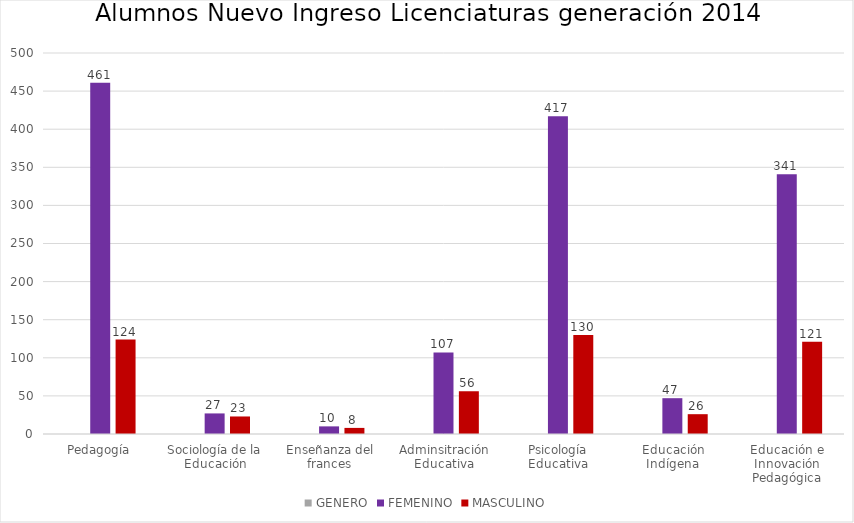
| Category | GENERO | FEMENINO | MASCULINO |
|---|---|---|---|
| Pedagogía |  | 461 | 124 |
| Sociología de la Educación |  | 27 | 23 |
| Enseñanza del frances |  | 10 | 8 |
| Adminsitración Educativa |  | 107 | 56 |
| Psicología Educativa |  | 417 | 130 |
| Educación Indígena |  | 47 | 26 |
| Educación e Innovación Pedagógica |  | 341 | 121 |